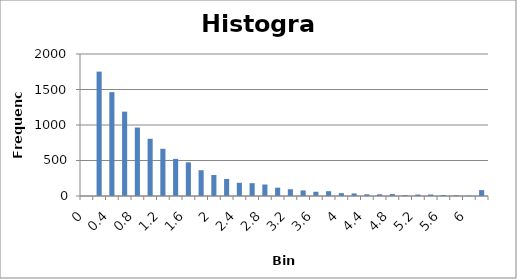
| Category | Series 0 |
|---|---|
| 0 | 0 |
| 0.2 | 1752 |
| 0.4 | 1463 |
| 0.6 | 1188 |
| 0.8 | 964 |
| 1 | 806 |
| 1.2 | 665 |
| 1.4 | 523 |
| 1.6 | 474 |
| 1.8 | 363 |
| 2 | 296 |
| 2.2 | 240 |
| 2.4 | 186 |
| 2.6 | 181 |
| 2.8 | 162 |
| 3 | 117 |
| 3.2 | 95 |
| 3.4 | 79 |
| 3.6 | 60 |
| 3.8 | 68 |
| 4 | 40 |
| 4.2 | 36 |
| 4.4 | 24 |
| 4.6 | 24 |
| 4.8 | 27 |
| 5 | 13 |
| 5.2 | 21 |
| 5.4 | 21 |
| 5.6 | 14 |
| 5.8 | 10 |
| 6 | 5 |
| More | 83 |